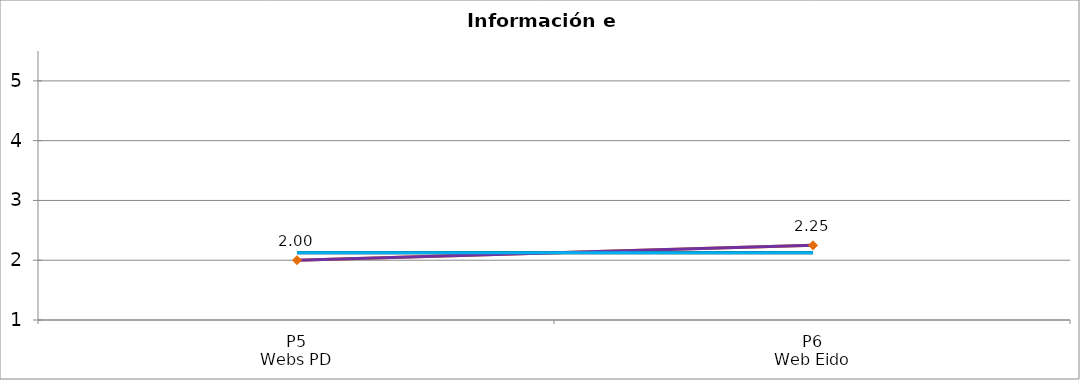
| Category | Valoración (1-5) | MEDIA |
|---|---|---|
| P5
Webs PD | 2 | 2.125 |
| P6
Web Eido | 2.25 | 2.125 |